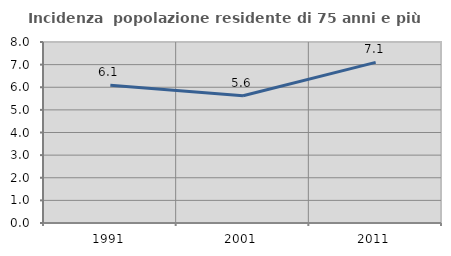
| Category | Incidenza  popolazione residente di 75 anni e più |
|---|---|
| 1991.0 | 6.087 |
| 2001.0 | 5.624 |
| 2011.0 | 7.098 |